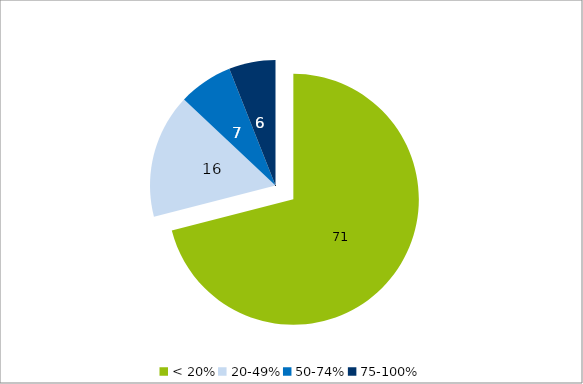
| Category | Spalte1 |
|---|---|
| < 20% | 71 |
| 20-49% | 16 |
| 50-74% | 7 |
| 75-100% | 6 |